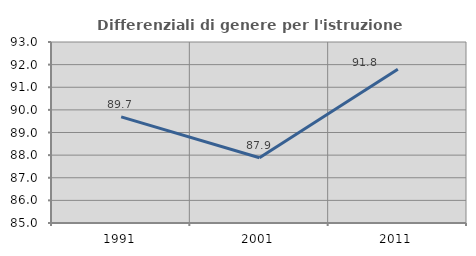
| Category | Differenziali di genere per l'istruzione superiore |
|---|---|
| 1991.0 | 89.691 |
| 2001.0 | 87.886 |
| 2011.0 | 91.798 |